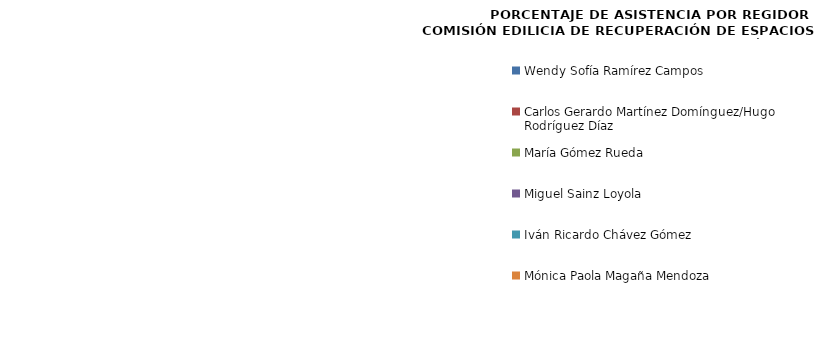
| Category | Series 0 |
|---|---|
| Wendy Sofía Ramírez Campos | 0 |
| Carlos Gerardo Martínez Domínguez/Hugo Rodríguez Díaz | 0 |
| María Gómez Rueda  | 0 |
| Miguel Sainz Loyola | 0 |
| Iván Ricardo Chávez Gómez | 0 |
| Mónica Paola Magaña Mendoza | 0 |